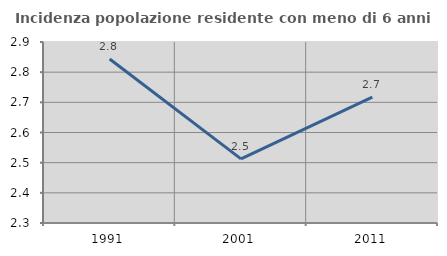
| Category | Incidenza popolazione residente con meno di 6 anni |
|---|---|
| 1991.0 | 2.844 |
| 2001.0 | 2.513 |
| 2011.0 | 2.717 |